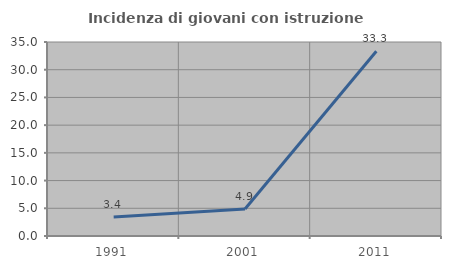
| Category | Incidenza di giovani con istruzione universitaria |
|---|---|
| 1991.0 | 3.448 |
| 2001.0 | 4.878 |
| 2011.0 | 33.333 |